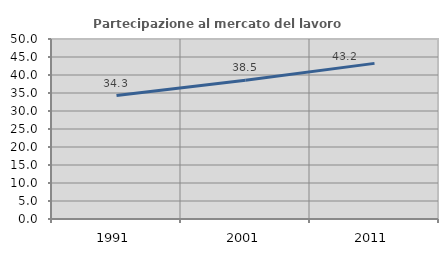
| Category | Partecipazione al mercato del lavoro  femminile |
|---|---|
| 1991.0 | 34.296 |
| 2001.0 | 38.536 |
| 2011.0 | 43.226 |